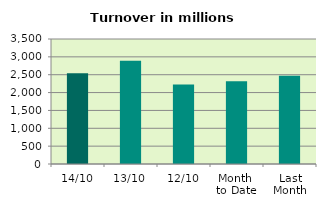
| Category | Series 0 |
|---|---|
| 14/10 | 2541.538 |
| 13/10 | 2892.417 |
| 12/10 | 2229.148 |
| Month 
to Date | 2316.196 |
| Last
Month | 2468.023 |